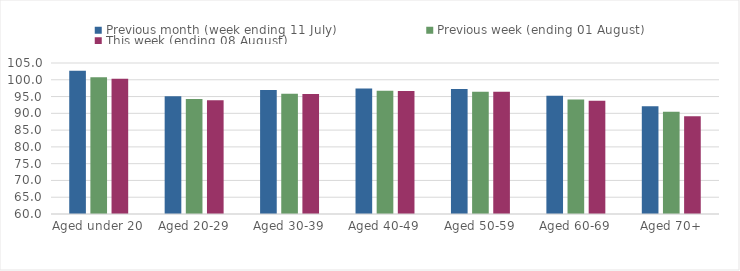
| Category | Previous month (week ending 11 July) | Previous week (ending 01 August) | This week (ending 08 August) |
|---|---|---|---|
| Aged under 20 | 102.69 | 100.789 | 100.342 |
| Aged 20-29 | 95.071 | 94.297 | 93.876 |
| Aged 30-39 | 96.97 | 95.871 | 95.735 |
| Aged 40-49 | 97.43 | 96.737 | 96.652 |
| Aged 50-59 | 97.225 | 96.419 | 96.444 |
| Aged 60-69 | 95.224 | 94.095 | 93.742 |
| Aged 70+ | 92.12 | 90.476 | 89.162 |